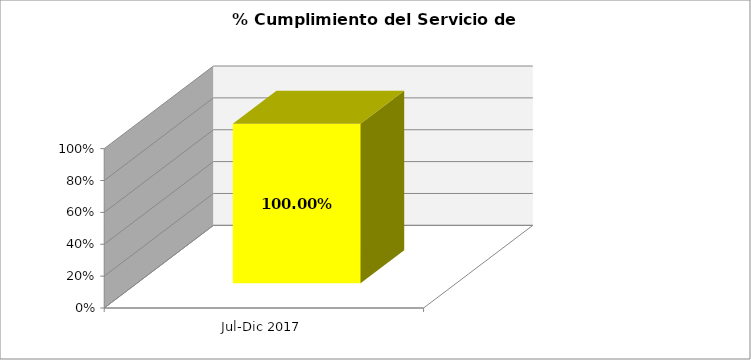
| Category | % |
|---|---|
| Jul-Dic 2017 | 1 |